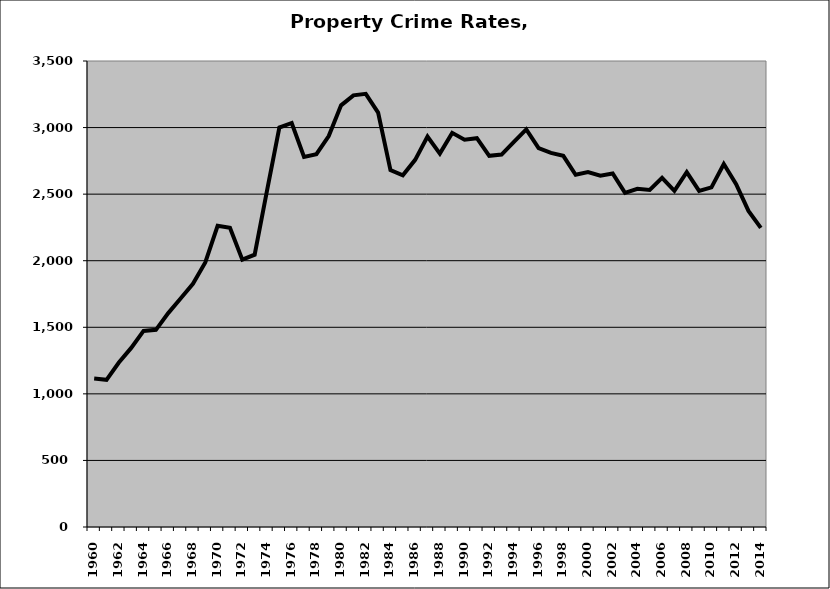
| Category | Property |
|---|---|
| 1960.0 | 1115.381 |
| 1961.0 | 1105.429 |
| 1962.0 | 1235.237 |
| 1963.0 | 1345.137 |
| 1964.0 | 1472.84 |
| 1965.0 | 1480.78 |
| 1966.0 | 1606.692 |
| 1967.0 | 1715.648 |
| 1968.0 | 1826.386 |
| 1969.0 | 1987.129 |
| 1970.0 | 2261.788 |
| 1971.0 | 2246.587 |
| 1972.0 | 2007.942 |
| 1973.0 | 2045.153 |
| 1974.0 | 2525.678 |
| 1975.0 | 3000.324 |
| 1976.0 | 3034.685 |
| 1977.0 | 2779.757 |
| 1978.0 | 2799.857 |
| 1979.0 | 2935.866 |
| 1980.0 | 3167.065 |
| 1981.0 | 3242.01 |
| 1982.0 | 3253.45 |
| 1983.0 | 3112.601 |
| 1984.0 | 2680.714 |
| 1985.0 | 2641.653 |
| 1986.0 | 2757.779 |
| 1987.0 | 2932.224 |
| 1988.0 | 2804.676 |
| 1989.0 | 2960.236 |
| 1990.0 | 2909.074 |
| 1991.0 | 2920.28 |
| 1992.0 | 2788.069 |
| 1993.0 | 2797.018 |
| 1994.0 | 2893.258 |
| 1995.0 | 2986.995 |
| 1996.0 | 2845.803 |
| 1997.0 | 2810.107 |
| 1998.0 | 2787.627 |
| 1999.0 | 2645.106 |
| 2000.0 | 2665.244 |
| 2001.0 | 2638.507 |
| 2002.0 | 2655.128 |
| 2003.0 | 2510.084 |
| 2004.0 | 2540.154 |
| 2005.0 | 2530.983 |
| 2006.0 | 2621.875 |
| 2007.0 | 2524.641 |
| 2008.0 | 2665.411 |
| 2009.0 | 2524.598 |
| 2010.0 | 2551.271 |
| 2011.0 | 2725.946 |
| 2012.0 | 2575.501 |
| 2013.0 | 2374.043 |
| 2014.0 | 2246.901 |